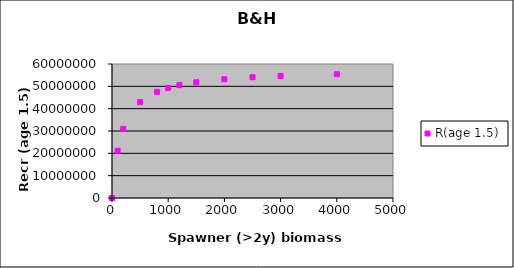
| Category | R(age 1.5) |
|---|---|
| 0.0 | 0 |
| 100.0 | 21143421.283 |
| 200.0 | 30963552.948 |
| 500.0 | 42925759.074 |
| 800.0 | 47514887.449 |
| 1000.0 | 49270706.504 |
| 1200.0 | 50515165.45 |
| 1500.0 | 51824117.381 |
| 2000.0 | 53202709.102 |
| 2500.0 | 54065640.668 |
| 3000.0 | 54656650.028 |
| 4000.0 | 55413833.656 |